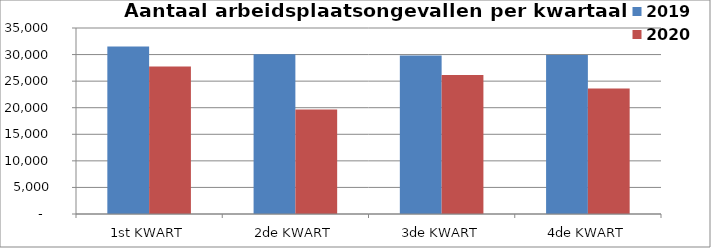
| Category | 2019 | 2020 |
|---|---|---|
| 1st KWART | 31508 | 27738 |
| 2de KWART | 30043 | 19664 |
| 3de KWART | 29807 | 26142 |
| 4de KWART | 29905 | 23629 |